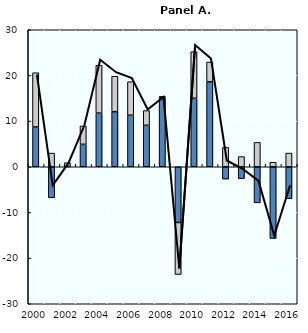
| Category | Precio | Volumen |
|---|---|---|
| 2000.0 | 8.72 | 11.873 |
| 2001.0 | -6.794 | 2.992 |
| 2002.0 | 0.059 | 0.828 |
| 2003.0 | 4.907 | 4.026 |
| 2004.0 | 11.737 | 10.503 |
| 2005.0 | 12.061 | 7.758 |
| 2006.0 | 11.286 | 7.339 |
| 2007.0 | 9.071 | 3.234 |
| 2008.0 | 15.272 | 0.056 |
| 2009.0 | -12.2 | -11.391 |
| 2010.0 | 15 | 10.191 |
| 2011.0 | 18.6 | 4.333 |
| 2012.0 | -2.7 | 4.237 |
| 2013.0 | -2.6 | 2.232 |
| 2014.0 | -7.9 | 5.337 |
| 2015.0 | -15.7 | 1 |
| 2016.0 | -7 | 3 |